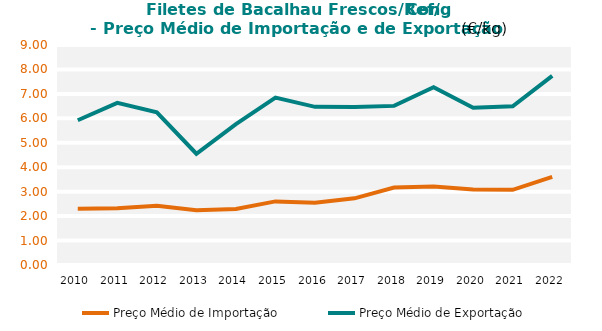
| Category | Preço Médio de Importação | Preço Médio de Exportação |
|---|---|---|
| 2010.0 | 2.301 | 5.922 |
| 2011.0 | 2.322 | 6.634 |
| 2012.0 | 2.42 | 6.248 |
| 2013.0 | 2.237 | 4.552 |
| 2014.0 | 2.293 | 5.767 |
| 2015.0 | 2.602 | 6.849 |
| 2016.0 | 2.549 | 6.47 |
| 2017.0 | 2.728 | 6.462 |
| 2018.0 | 3.167 | 6.509 |
| 2019.0 | 3.214 | 7.269 |
| 2020.0 | 3.093 | 6.431 |
| 2021.0 | 3.075 | 6.494 |
| 2022.0 | 3.605 | 7.739 |